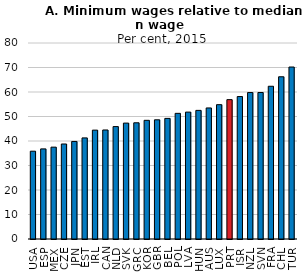
| Category | 2014 |
|---|---|
| USA | 35.838 |
| ESP | 36.774 |
| MEX | 37.491 |
| CZE | 38.776 |
| JPN | 39.818 |
| EST | 41.261 |
| IRL | 44.436 |
| CAN | 44.5 |
| NLD | 45.885 |
| SVK | 47.303 |
| GRC | 47.433 |
| KOR | 48.443 |
| GBR | 48.653 |
| BEL | 49.225 |
| POL | 51.285 |
| LVA | 51.796 |
| HUN | 52.5 |
| AUS | 53.493 |
| LUX | 54.831 |
| PRT | 56.886 |
| ISR | 58.142 |
| NZL | 59.782 |
| SVN | 59.799 |
| FRA | 62.341 |
| CHL | 66.214 |
| TUR | 70.197 |